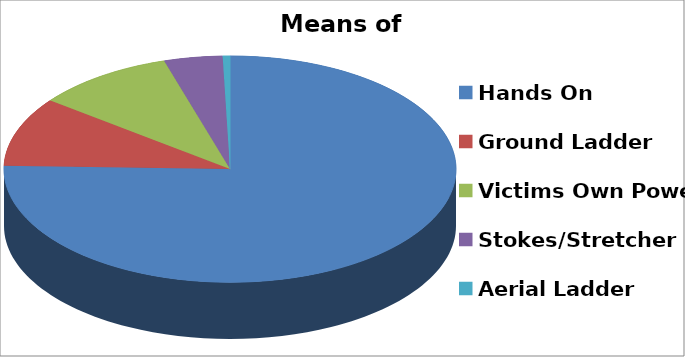
| Category | Series 0 |
|---|---|
| Hands On | 867 |
| Ground Ladder | 114 |
| Victims Own Power | 114 |
| Stokes/Stretcher | 48 |
| Aerial Ladder | 6 |